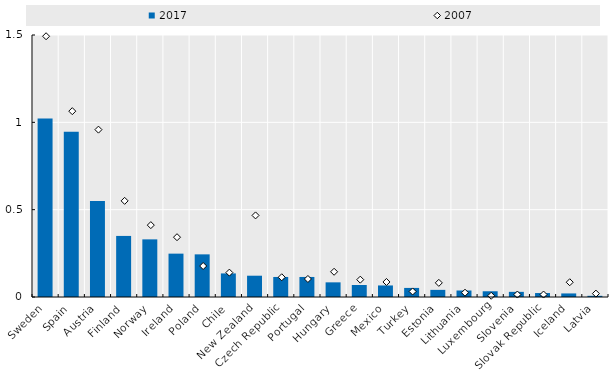
| Category | 2017 |
|---|---|
| Sweden | 1.023 |
| Spain | 0.946 |
| Austria | 0.55 |
| Finland | 0.35 |
| Norway | 0.33 |
| Ireland | 0.248 |
| Poland | 0.244 |
| Chile | 0.135 |
| New Zealand | 0.122 |
| Czech Republic | 0.115 |
| Portugal | 0.115 |
| Hungary | 0.084 |
| Greece | 0.069 |
| Mexico | 0.066 |
| Turkey | 0.052 |
| Estonia | 0.041 |
| Lithuania | 0.037 |
| Luxembourg | 0.033 |
| Slovenia | 0.029 |
| Slovak Republic | 0.023 |
| Iceland | 0.02 |
| Latvia | 0.007 |